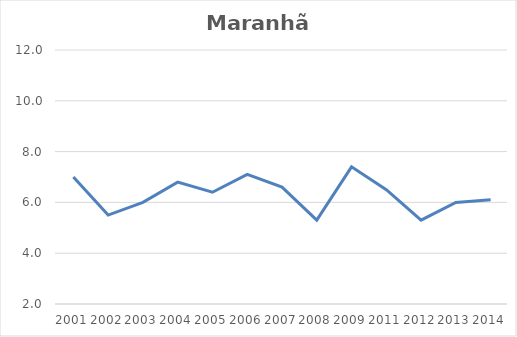
| Category | Total |
|---|---|
| 2001.0 | 7 |
| 2002.0 | 5.5 |
| 2003.0 | 6 |
| 2004.0 | 6.8 |
| 2005.0 | 6.4 |
| 2006.0 | 7.1 |
| 2007.0 | 6.6 |
| 2008.0 | 5.3 |
| 2009.0 | 7.4 |
| 2011.0 | 6.5 |
| 2012.0 | 5.3 |
| 2013.0 | 6 |
| 2014.0 | 6.1 |